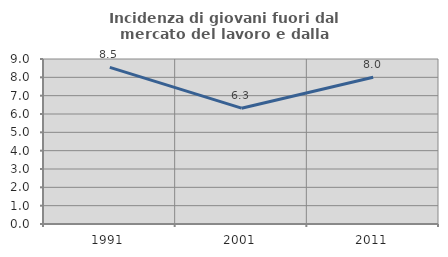
| Category | Incidenza di giovani fuori dal mercato del lavoro e dalla formazione  |
|---|---|
| 1991.0 | 8.543 |
| 2001.0 | 6.317 |
| 2011.0 | 8.005 |